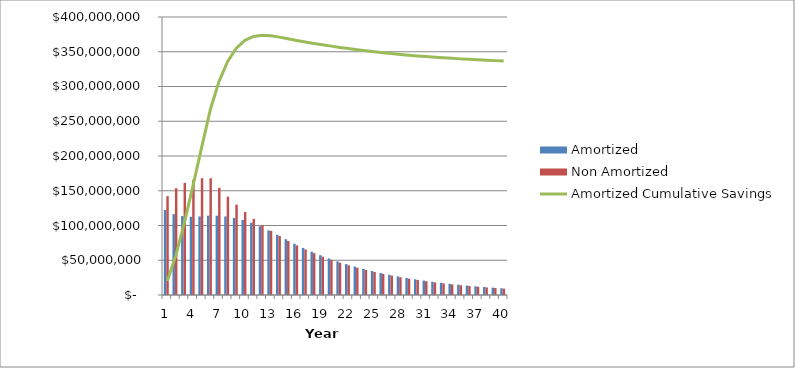
| Category | Amortized | Non Amortized |
|---|---|---|
| 0 | 122250068.508 | 142260000 |
| 1 | 116371097.21 | 153640800 |
| 2 | 113455805.731 | 161322840 |
| 3 | 112580788.149 | 165932064 |
| 4 | 113025470.998 | 168006214.8 |
| 5 | 114235117.82 | 168006214.8 |
| 6 | 114116110.06 | 154229705.186 |
| 7 | 112913658.477 | 141582869.361 |
| 8 | 110838394.395 | 129973074.074 |
| 9 | 108070688.492 | 119315281.999 |
| 10 | 103989242.626 | 109531428.876 |
| 11 | 98831459.714 | 100549851.708 |
| 12 | 92966215.769 | 92304763.868 |
| 13 | 86684887.569 | 84735773.231 |
| 14 | 80214937.194 | 77787439.826 |
| 15 | 73731344.521 | 71408869.76 |
| 16 | 67770003.229 | 65553342.44 |
| 17 | 62289029.028 | 60177968.36 |
| 18 | 57249878.104 | 55243374.954 |
| 19 | 52617082.611 | 50713418.208 |
| 20 | 48358006.897 | 46554917.915 |
| 21 | 44442622.886 | 42737414.646 |
| 22 | 40843303.108 | 39232946.645 |
| 23 | 37534630.022 | 36015845.02 |
| 24 | 34493220.352 | 33062545.728 |
| 25 | 31697563.276 | 30351416.979 |
| 26 | 29127871.38 | 27862600.786 |
| 27 | 26765943.391 | 25577867.522 |
| 28 | 24595037.751 | 23480482.385 |
| 29 | 22599756.201 | 21555082.83 |
| 30 | 20765936.584 | 19787566.037 |
| 31 | 19080554.136 | 18164985.622 |
| 32 | 17531630.614 | 16675456.801 |
| 33 | 16108150.629 | 15308069.344 |
| 34 | 14799984.63 | 14052807.657 |
| 35 | 13597818.008 | 12900477.43 |
| 36 | 12493085.837 | 11842638.28 |
| 37 | 11477912.814 | 10871541.941 |
| 38 | 10545057.977 | 9980075.502 |
| 39 | 9687863.835 | 9161709.311 |